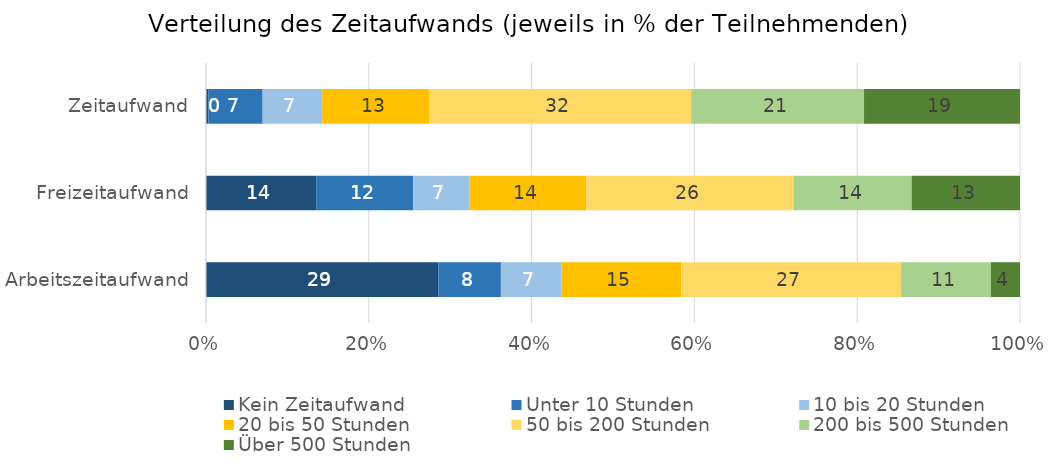
| Category | Kein Zeitaufwand | Unter 10 Stunden | 10 bis 20 Stunden | 20 bis 50 Stunden | 50 bis 200 Stunden | 200 bis 500 Stunden | Über 500 Stunden |
|---|---|---|---|---|---|---|---|
| Arbeitszeitaufwand | 28.55 | 7.67 | 7.46 | 14.68 | 27.03 | 11.01 | 3.58 |
| Freizeitaufwand | 13.54 | 11.92 | 6.89 | 14.37 | 25.51 | 14.46 | 13.31 |
| Zeitaufwand | 0.31 | 6.65 | 7.32 | 13.18 | 32.14 | 21.24 | 19.16 |